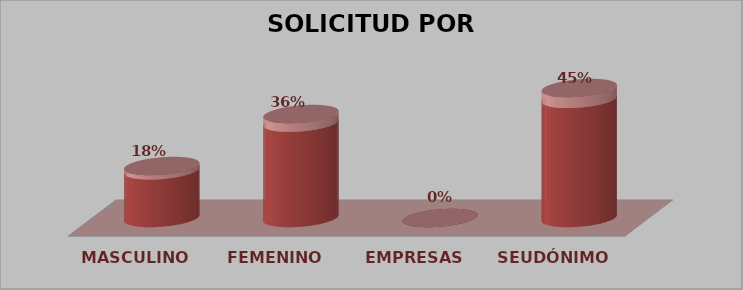
| Category | SOLICITUD POR GÉNERO | Series 1 |
|---|---|---|
| MASCULINO | 2 | 0.182 |
| FEMENINO | 4 | 0.364 |
| EMPRESAS | 0 | 0 |
| SEUDÓNIMO | 5 | 0.455 |